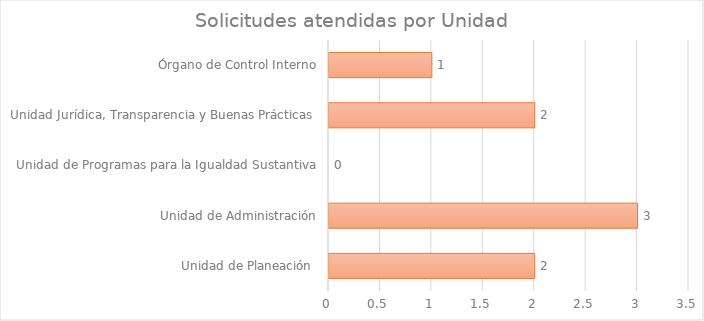
| Category | Series 1 |
|---|---|
| Unidad de Planeación  | 2 |
| Unidad de Administración | 3 |
| Unidad de Programas para la Igualdad Sustantiva | 0 |
| Unidad Jurídica, Transparencia y Buenas Prácticas  | 2 |
| Órgano de Control Interno | 1 |